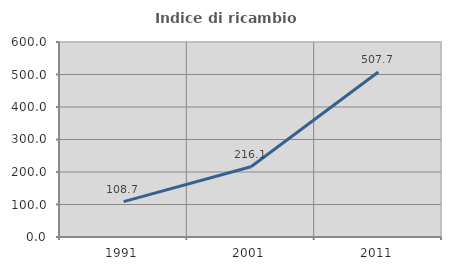
| Category | Indice di ricambio occupazionale  |
|---|---|
| 1991.0 | 108.696 |
| 2001.0 | 216.129 |
| 2011.0 | 507.692 |